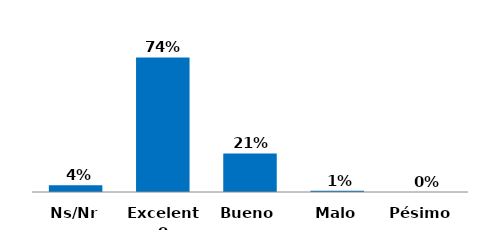
| Category | Series 0 |
|---|---|
| Pésimo  | 0 |
| Malo | 0.007 |
| Bueno | 0.213 |
| Excelente | 0.743 |
| Ns/Nr | 0.037 |